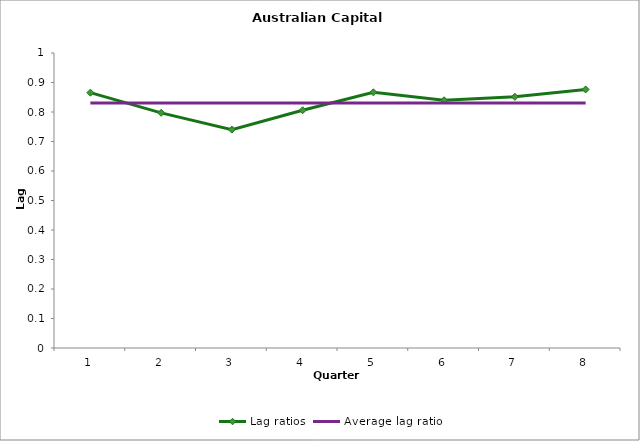
| Category | Lag ratios | Average lag ratio |
|---|---|---|
| 0 | 0.866 | 0.83 |
| 1 | 0.797 | 0.83 |
| 2 | 0.74 | 0.83 |
| 3 | 0.806 | 0.83 |
| 4 | 0.867 | 0.83 |
| 5 | 0.84 | 0.83 |
| 6 | 0.851 | 0.83 |
| 7 | 0.876 | 0.83 |